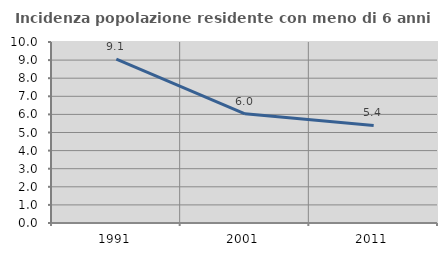
| Category | Incidenza popolazione residente con meno di 6 anni |
|---|---|
| 1991.0 | 9.051 |
| 2001.0 | 6.035 |
| 2011.0 | 5.387 |